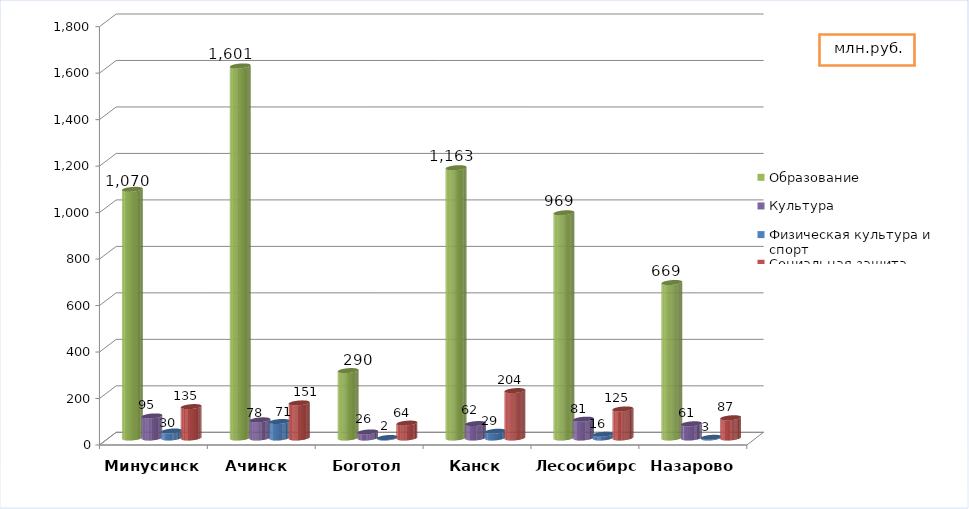
| Category | Образование | Культура | Физическая культура и спорт | Социальная защита |
|---|---|---|---|---|
| Минусинск | 1070 | 95 | 30 | 135 |
| Ачинск  | 1601 | 78 | 71 | 151 |
| Боготол | 290 | 26 | 2 | 64 |
| Канск | 1163 | 62 | 29 | 204 |
| Лесосибирск | 969 | 81 | 16 | 125 |
| Назарово | 669 | 61 | 3 | 87 |